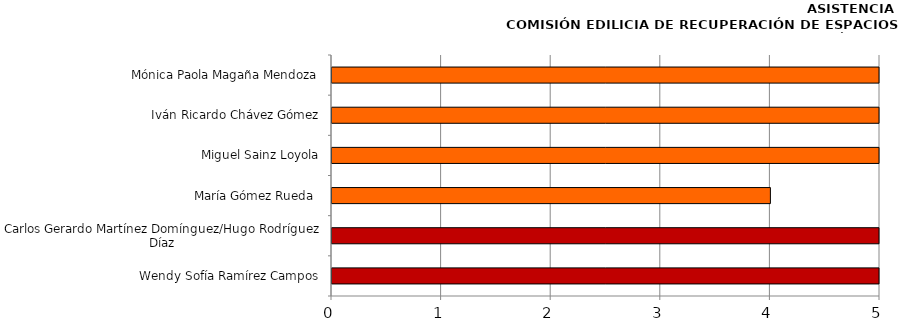
| Category | Series 0 |
|---|---|
| Wendy Sofía Ramírez Campos | 13 |
| Carlos Gerardo Martínez Domínguez/Hugo Rodríguez Díaz | 8 |
| María Gómez Rueda  | 4 |
| Miguel Sainz Loyola | 10 |
| Iván Ricardo Chávez Gómez | 10 |
| Mónica Paola Magaña Mendoza | 12 |